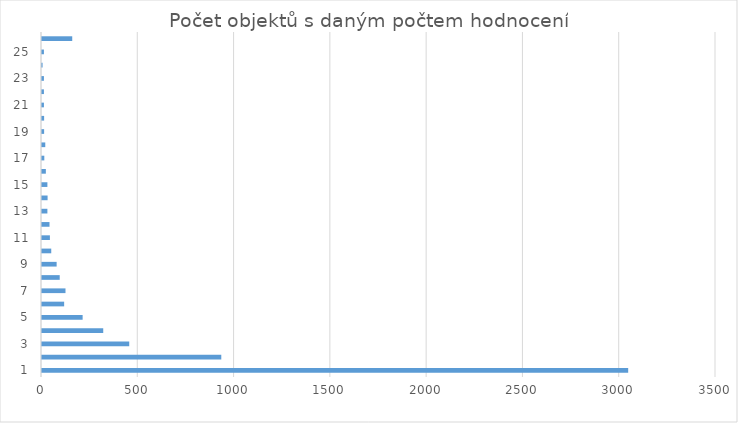
| Category | Objects |
|---|---|
| 1 | 3044 |
| 2 | 931 |
| 3 | 453 |
| 4 | 318 |
| 5 | 211 |
| 6 | 115 |
| 7 | 122 |
| 8 | 92 |
| 9 | 76 |
| 10 | 48 |
| 11 | 41 |
| 12 | 39 |
| 13 | 28 |
| 14 | 29 |
| 15 | 28 |
| 16 | 20 |
| 17 | 12 |
| 18 | 17 |
| 19 | 11 |
| 20 | 11 |
| 21 | 10 |
| 22 | 10 |
| 23 | 10 |
| 24 | 3 |
| 25 | 10 |
| >25 | 157 |